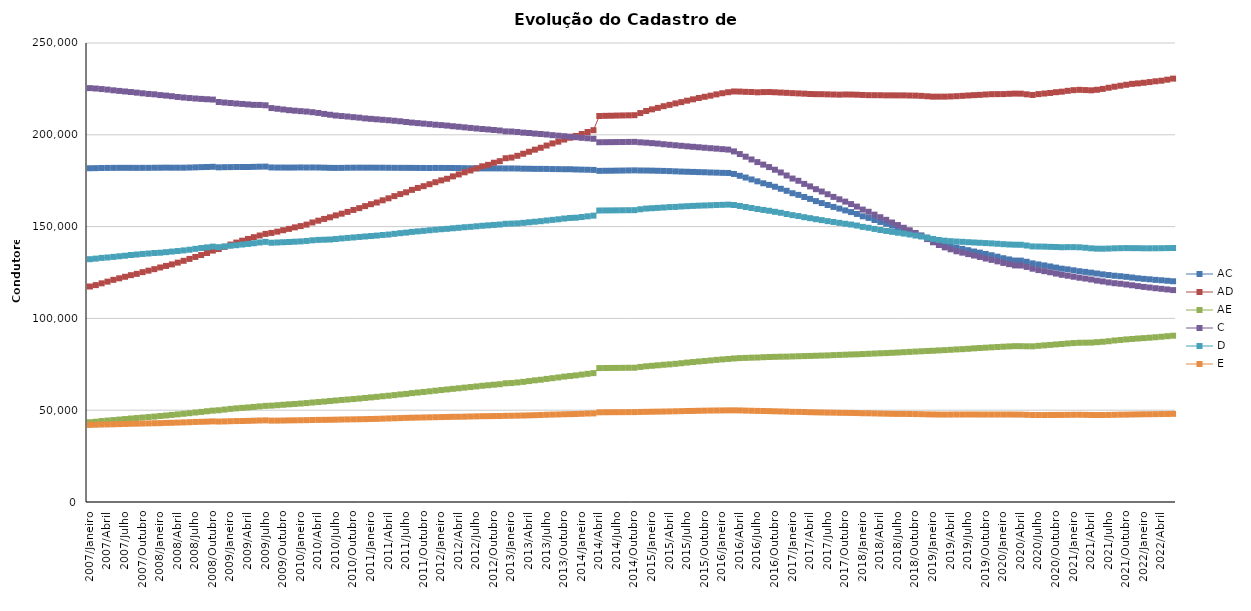
| Category | AC | AD | AE | C | D | E |
|---|---|---|---|---|---|---|
| 2007/Janeiro | 181791 | 117376 | 43453 | 225424 | 132256 | 42010 |
| 2007/Fevereiro | 181839 | 118134 | 43717 | 225208 | 132560 | 42089 |
| 2007/Março | 181925 | 119096 | 44086 | 224917 | 132959 | 42192 |
| 2007/Abril | 181961 | 120021 | 44347 | 224613 | 133182 | 42250 |
| 2007/Maio | 181984 | 120992 | 44626 | 224229 | 133516 | 42326 |
| 2007/Junho | 182009 | 121833 | 44897 | 223913 | 133828 | 42416 |
| 2007/Julho | 182009 | 122665 | 45181 | 223599 | 134142 | 42523 |
| 2007/Agosto | 182000 | 123541 | 45473 | 223293 | 134528 | 42603 |
| 2007/Setembro | 181978 | 124253 | 45733 | 222949 | 134795 | 42660 |
| 2007/Outubro | 182008 | 125189 | 46013 | 222604 | 135104 | 42734 |
| 2007/Novembro | 181995 | 126001 | 46273 | 222266 | 135349 | 42818 |
| 2007/Dezembro | 182056 | 126816 | 46507 | 222042 | 135637 | 42899 |
| 2008/Janeiro | 182073 | 127731 | 46824 | 221631 | 135771 | 42952 |
| 2008/Fevereiro | 182116 | 128569 | 47117 | 221354 | 136076 | 43084 |
| 2008/Março | 182071 | 129420 | 47427 | 221019 | 136401 | 43154 |
| 2008/Abril | 182081 | 130372 | 47736 | 220604 | 136691 | 43262 |
| 2008/Maio | 182087 | 131372 | 48048 | 220294 | 137035 | 43349 |
| 2008/Junho | 182175 | 132407 | 48370 | 220026 | 137401 | 43477 |
| 2008/Julho | 182269 | 133465 | 48748 | 219774 | 137887 | 43606 |
| 2008/Agosto | 182384 | 134505 | 49065 | 219550 | 138324 | 43692 |
| 2008/Setembro | 182471 | 135616 | 49429 | 219371 | 138683 | 43790 |
| 2008/Outubro | 182576 | 136929 | 49766 | 219184 | 139091 | 43906 |
| 2008/Novembro | 182274 | 137775 | 49979 | 217852 | 138794 | 43811 |
| 2008/Dezembro | 182366 | 138975 | 50343 | 217562 | 139201 | 43888 |
| 2009/Janeiro | 182404 | 140218 | 50722 | 217307 | 139551 | 43996 |
| 2009/Fevereiro | 182463 | 141290 | 51008 | 217026 | 139874 | 44078 |
| 2009/Março | 182474 | 142332 | 51281 | 216808 | 140244 | 44118 |
| 2009/Abril | 182468 | 143287 | 51506 | 216556 | 140571 | 44197 |
| 2009/Maio | 182551 | 144247 | 51790 | 216311 | 140930 | 44293 |
| 2009/Junho | 182634 | 145151 | 52084 | 216271 | 141344 | 44397 |
| 2009/Julho | 182676 | 146035 | 52364 | 216066 | 141694 | 44476 |
| 2009/Agosto | 182216 | 146561 | 52483 | 214560 | 141208 | 44328 |
| 2009/Setembro | 182163 | 147249 | 52722 | 214181 | 141347 | 44333 |
| 2009/Outubro | 182163 | 148023 | 52964 | 213797 | 141502 | 44375 |
| 2009/Novembro | 182139 | 148757 | 53200 | 213405 | 141622 | 44449 |
| 2009/Dezembro | 182163 | 149577 | 53398 | 213133 | 141775 | 44481 |
| 2010/Janeiro | 182212 | 150280 | 53639 | 212879 | 141942 | 44532 |
| 2010/Fevereiro | 182173 | 151078 | 53883 | 212655 | 142190 | 44589 |
| 2010/Março | 182201 | 152257 | 54184 | 212315 | 142538 | 44673 |
| 2010/Abril | 182175 | 153222 | 54437 | 211906 | 142757 | 44718 |
| 2010/Maio | 182097 | 154180 | 54708 | 211380 | 142860 | 44741 |
| 2010/Junho | 182005 | 155065 | 55002 | 210928 | 142963 | 44782 |
| 2010/Julho | 181961 | 156107 | 55287 | 210500 | 143252 | 44844 |
| 2010/Agosto | 181983 | 157039 | 55583 | 210210 | 143565 | 44925 |
| 2010/Setembro | 182057 | 158008 | 55808 | 209949 | 143830 | 44981 |
| 2010/Outubro | 182080 | 159060 | 56079 | 209607 | 144087 | 45025 |
| 2010/Novembro | 182105 | 160060 | 56344 | 209339 | 144357 | 45082 |
| 2010/Dezembro | 182087 | 161154 | 56680 | 208937 | 144619 | 45145 |
| 2011/Janeiro | 182098 | 162207 | 56964 | 208683 | 144860 | 45223 |
| 2011/Fevereiro | 182069 | 163127 | 57270 | 208429 | 145109 | 45289 |
| 2011/Março | 182077 | 164318 | 57608 | 208173 | 145440 | 45401 |
| 2011/Abril | 182034 | 165403 | 57886 | 207928 | 145667 | 45504 |
| 2011/Maio | 182021 | 166606 | 58216 | 207643 | 146060 | 45612 |
| 2011/Junho | 181996 | 167704 | 58586 | 207357 | 146418 | 45718 |
| 2011/Julho | 181994 | 168681 | 58870 | 206981 | 146722 | 45826 |
| 2011/Agosto | 181987 | 170006 | 59304 | 206637 | 147129 | 45922 |
| 2011/Setembro | 181949 | 171057 | 59616 | 206367 | 147394 | 45979 |
| 2011/Outubro | 181936 | 172022 | 59936 | 206093 | 147685 | 46048 |
| 2011/Novembro | 181905 | 173086 | 60281 | 205807 | 147998 | 46119 |
| 2011/Dezembro | 181951 | 174170 | 60626 | 205507 | 148292 | 46187 |
| 2012/Janeiro | 181953 | 175178 | 60978 | 205279 | 148570 | 46261 |
| 2012/Fevereiro | 181935 | 176051 | 61304 | 205013 | 148783 | 46322 |
| 2012/Março | 181903 | 177353 | 61645 | 204660 | 149096 | 46408 |
| 2012/Abril | 181888 | 178420 | 61945 | 204374 | 149348 | 46437 |
| 2012/Maio | 181830 | 179566 | 62293 | 204052 | 149654 | 46497 |
| 2012/Junho | 181779 | 180577 | 62615 | 203746 | 149869 | 46581 |
| 2012/Julho | 181756 | 181697 | 62949 | 203443 | 150168 | 46652 |
| 2012/Agosto | 181702 | 182840 | 63311 | 203166 | 150453 | 46729 |
| 2012/Setembro | 181708 | 183635 | 63596 | 202910 | 150676 | 46757 |
| 2012/Outubro | 181702 | 184794 | 63897 | 202604 | 150909 | 46809 |
| 2012/Novembro | 181705 | 185645 | 64144 | 202345 | 151135 | 46846 |
| 2012/Dezembro | 181679 | 187243 | 64653 | 201854 | 151526 | 46931 |
| 2013/Janeiro | 181686 | 187599 | 64789 | 201784 | 151630 | 46976 |
| 2013/Fevereiro | 181638 | 188557 | 65105 | 201526 | 151760 | 47046 |
| 2013/Março | 181549 | 189693 | 65441 | 201190 | 152043 | 47110 |
| 2013/Abril | 181508 | 190765 | 65856 | 200985 | 152359 | 47189 |
| 2013/Maio | 181447 | 191901 | 66266 | 200666 | 152651 | 47286 |
| 2013/Junho | 181443 | 192950 | 66597 | 200440 | 152956 | 47380 |
| 2013/Julho | 181416 | 194135 | 67049 | 200169 | 153325 | 47501 |
| 2013/Agosto | 181345 | 195303 | 67444 | 199811 | 153665 | 47614 |
| 2013/Setembro | 181303 | 196252 | 67841 | 199519 | 153977 | 47686 |
| 2013/Outubro | 181252 | 197405 | 68303 | 199247 | 154386 | 47792 |
| 2013/Novembro | 181249 | 198400 | 68638 | 198971 | 154707 | 47856 |
| 2013/Dezembro | 181118 | 199380 | 68971 | 198677 | 154848 | 47944 |
| 2014/Janeiro | 181033 | 200424 | 69406 | 198366 | 155238 | 48055 |
| 2014/Fevereiro | 180968 | 201512 | 69815 | 198114 | 155593 | 48191 |
| 2014/Março | 180880 | 202509 | 70193 | 197834 | 155965 | 48263 |
| 2014/Abril | 180364 | 210235 | 72935 | 195944 | 158762 | 48857 |
| 2014/Maio | 180405 | 210330 | 72975 | 195977 | 158796 | 48887 |
| 2014/Junho | 180430 | 210390 | 73009 | 196010 | 158822 | 48903 |
| 2014/Julho | 180487 | 210477 | 73043 | 196049 | 158860 | 48919 |
| 2014/Agosto | 180536 | 210543 | 73078 | 196081 | 158896 | 48937 |
| 2014/Setembro | 180591 | 210604 | 73108 | 196122 | 158927 | 48954 |
| 2014/Outubro | 180632 | 210672 | 73138 | 196155 | 158953 | 48967 |
| 2014/Novembro | 180565 | 211835 | 73574 | 195906 | 159439 | 49048 |
| 2014/Dezembro | 180531 | 212951 | 73930 | 195716 | 159822 | 49110 |
| 2015/Janeiro | 180486 | 213858 | 74184 | 195460 | 160013 | 49172 |
| 2015/Fevereiro | 180404 | 214665 | 74462 | 195207 | 160198 | 49222 |
| 2015/Março | 180326 | 215570 | 74739 | 194864 | 160399 | 49275 |
| 2015/Abril | 180227 | 216293 | 74977 | 194572 | 160622 | 49330 |
| 2015/Maio | 180104 | 217086 | 75268 | 194293 | 160720 | 49403 |
| 2015/Junho | 179966 | 217793 | 75588 | 194015 | 160959 | 49480 |
| 2015/Julho | 179876 | 218587 | 75941 | 193731 | 161110 | 49560 |
| 2015/Agosto | 179783 | 219311 | 76231 | 193464 | 161272 | 49605 |
| 2015/Setembro | 179677 | 220036 | 76533 | 193218 | 161407 | 49691 |
| 2015/Outubro | 179598 | 220700 | 76805 | 192949 | 161511 | 49750 |
| 2015/Novembro | 179467 | 221326 | 77104 | 192694 | 161622 | 49809 |
| 2015/Dezembro | 179382 | 222018 | 77403 | 192460 | 161781 | 49859 |
| 2016/Janeiro | 179274 | 222641 | 77668 | 192193 | 161856 | 49873 |
| 2016/Fevereiro | 179212 | 223188 | 77914 | 191944 | 161973 | 49916 |
| 2016/Março | 178667 | 223596 | 78196 | 190953 | 161778 | 49928 |
| 2016/Abril | 177666 | 223546 | 78380 | 189507 | 161258 | 49878 |
| 2016/Maio | 176722 | 223401 | 78493 | 188077 | 160697 | 49774 |
| 2016/Junho | 175678 | 223304 | 78604 | 186568 | 160134 | 49697 |
| 2016/Julho | 174654 | 223145 | 78683 | 185128 | 159563 | 49612 |
| 2016/Agosto | 173604 | 223255 | 78861 | 183763 | 159095 | 49568 |
| 2016/Setembro | 172729 | 223283 | 78980 | 182416 | 158634 | 49505 |
| 2016/Outubro | 171711 | 223160 | 79064 | 180977 | 158061 | 49400 |
| 2016/Novembro | 170599 | 222998 | 79139 | 179478 | 157535 | 49320 |
| 2016/Dezembro | 169501 | 222853 | 79191 | 177839 | 156857 | 49238 |
| 2017/Janeiro | 168179 | 222686 | 79293 | 176184 | 156236 | 49110 |
| 2017/Fevereiro | 167283 | 222551 | 79390 | 174950 | 155738 | 49075 |
| 2017/Março | 166135 | 222409 | 79476 | 173256 | 155110 | 49015 |
| 2017/Abril | 165090 | 222233 | 79560 | 171906 | 154594 | 48903 |
| 2017/Maio | 163889 | 222135 | 79654 | 170386 | 154031 | 48833 |
| 2017/Junho | 162812 | 222115 | 79759 | 169097 | 153529 | 48765 |
| 2017/Julho | 161767 | 222027 | 79843 | 167624 | 152979 | 48703 |
| 2017/Agosto | 160717 | 221948 | 80010 | 166178 | 152526 | 48654 |
| 2017/Setembro | 159810 | 221859 | 80113 | 164871 | 152041 | 48585 |
| 2017/Outubro | 158820 | 221958 | 80235 | 163603 | 151543 | 48553 |
| 2017/Novembro | 157906 | 221932 | 80358 | 162260 | 151116 | 48512 |
| 2017/Dezembro | 156891 | 221834 | 80439 | 160899 | 150589 | 48448 |
| 2018/Janeiro | 155615 | 221694 | 80587 | 159268 | 149847 | 48335 |
| 2018/Fevereiro | 154729 | 221587 | 80715 | 158076 | 149353 | 48317 |
| 2018/Março | 153598 | 221572 | 80861 | 156507 | 148739 | 48233 |
| 2018/Abril | 152541 | 221546 | 81006 | 155109 | 148143 | 48160 |
| 2018/Maio | 151528 | 221480 | 81105 | 153691 | 147628 | 48094 |
| 2018/Junho | 150524 | 221494 | 81264 | 152233 | 147149 | 48020 |
| 2018/Julho | 149443 | 221463 | 81417 | 150841 | 146662 | 47980 |
| 2018/Agosto | 148308 | 221477 | 81599 | 149362 | 146203 | 47982 |
| 2018/Setembro | 147406 | 221389 | 81768 | 148007 | 145701 | 47944 |
| 2018/Outubro | 146313 | 221345 | 81930 | 146512 | 145128 | 47897 |
| 2018/Novembro | 145187 | 221203 | 82093 | 144945 | 144586 | 47822 |
| 2018/Dezembro | 143989 | 220978 | 82243 | 143189 | 143931 | 47741 |
| 2019/Janeiro | 142635 | 220777 | 82384 | 141458 | 143281 | 47677 |
| 2019/Fevereiro | 141504 | 220780 | 82563 | 139983 | 142740 | 47625 |
| 2019/Março | 140402 | 220790 | 82727 | 138685 | 142334 | 47597 |
| 2019/Abril | 139440 | 220892 | 82902 | 137643 | 142066 | 47627 |
| 2019/Maio | 138544 | 221041 | 83113 | 136559 | 141846 | 47658 |
| 2019/Junho | 137880 | 221224 | 83250 | 135806 | 141711 | 47650 |
| 2019/Julho | 137152 | 221421 | 83442 | 135013 | 141510 | 47666 |
| 2019/Agosto | 136424 | 221599 | 83684 | 134241 | 141347 | 47657 |
| 2019/Setembro | 135813 | 221742 | 83890 | 133458 | 141191 | 47642 |
| 2019/Outubro | 135104 | 221959 | 84057 | 132606 | 141016 | 47627 |
| 2019/Novembro | 134396 | 222123 | 84255 | 131869 | 140857 | 47641 |
| 2019/Dezembro | 133617 | 222153 | 84428 | 131068 | 140653 | 47646 |
| 2020/Janeiro | 132779 | 222179 | 84602 | 130226 | 140437 | 47644 |
| 2020/Fevereiro | 132128 | 222326 | 84751 | 129544 | 140250 | 47654 |
| 2020/Março | 131503 | 222437 | 84892 | 128852 | 140146 | 47624 |
| 2020/Abril | 131473 | 222397 | 84873 | 128799 | 140100 | 47604 |
| 2020/Maio | 130840 | 222049 | 84804 | 128040 | 139695 | 47489 |
| 2020/Junho | 129964 | 221693 | 84793 | 127070 | 139207 | 47384 |
| 2020/Julho | 129399 | 222164 | 85065 | 126325 | 139153 | 47375 |
| 2020/Agosto | 128869 | 222478 | 85310 | 125727 | 139103 | 47363 |
| 2020/Setembro | 128295 | 222791 | 85554 | 125120 | 138972 | 47411 |
| 2020/Outubro | 127688 | 223199 | 85827 | 124415 | 138891 | 47433 |
| 2020/Novembro | 127078 | 223493 | 86068 | 123757 | 138753 | 47426 |
| 2020/Dezembro | 126708 | 223949 | 86344 | 123249 | 138824 | 47481 |
| 2021/Janeiro | 126197 | 224312 | 86570 | 122699 | 138820 | 47498 |
| 2021/Fevereiro | 125696 | 224493 | 86728 | 122151 | 138725 | 47520 |
| 2021/Março | 125327 | 224363 | 86780 | 121717 | 138487 | 47469 |
| 2021/Abril | 124920 | 224226 | 86824 | 121195 | 138169 | 47407 |
| 2021/Maio | 124454 | 224520 | 87056 | 120584 | 137978 | 47363 |
| 2021/Junho | 123992 | 225005 | 87277 | 120131 | 137952 | 47385 |
| 2021/Julho | 123618 | 225631 | 87567 | 119593 | 138044 | 47426 |
| 2021/Agosto | 123242 | 226199 | 87968 | 119170 | 138171 | 47491 |
| 2021/Setembro | 122976 | 226731 | 88255 | 118871 | 138253 | 47563 |
| 2021/Outubro | 122653 | 227240 | 88558 | 118464 | 138307 | 47599 |
| 2021/Novembro | 122257 | 227743 | 88800 | 118038 | 138263 | 47672 |
| 2021/Dezembro | 121852 | 228010 | 89053 | 117576 | 138252 | 47721 |
| 2022/Janeiro | 121544 | 228349 | 89269 | 117160 | 138184 | 47784 |
| 2022/Fevereiro | 121299 | 228733 | 89487 | 116822 | 138174 | 47810 |
| 2022/Março | 120991 | 229148 | 89738 | 116438 | 138214 | 47852 |
| 2022/Abril | 120771 | 229466 | 90008 | 116115 | 138236 | 47899 |
| 2022/Maio | 120494 | 230012 | 90299 | 115776 | 138289 | 47947 |
| 2022/Junho | 120227 | 230595 | 90568 | 115417 | 138337 | 48004 |